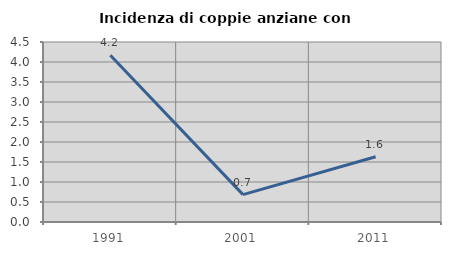
| Category | Incidenza di coppie anziane con figli |
|---|---|
| 1991.0 | 4.167 |
| 2001.0 | 0.685 |
| 2011.0 | 1.63 |